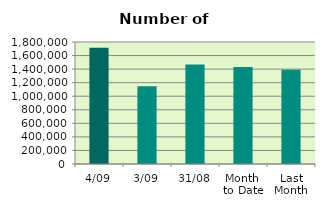
| Category | Series 0 |
|---|---|
| 4/09 | 1713612 |
| 3/09 | 1147782 |
| 31/08 | 1467024 |
| Month 
to Date | 1430697 |
| Last
Month | 1391040.957 |